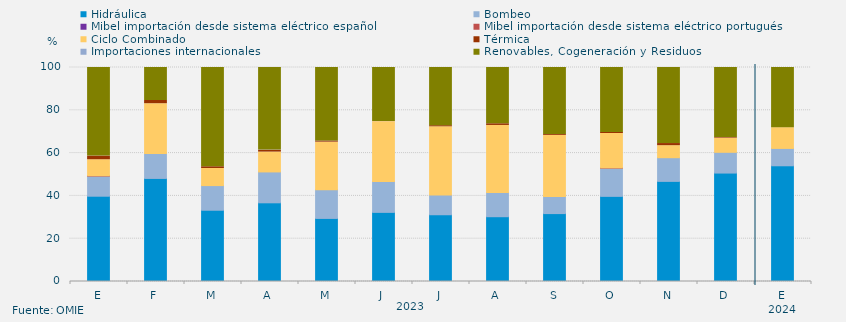
| Category | Hidráulica | Bombeo | Mibel importación desde sistema eléctrico español | Mibel importación desde sistema eléctrico portugués | Ciclo Combinado | Térmica | Importaciones internacionales | Renovables, Cogeneración y Residuos |
|---|---|---|---|---|---|---|---|---|
| E | 39.852 | 9.42 | 0 | 0.134 | 7.493 | 1.703 | 0 | 41.398 |
| F | 48.165 | 11.657 | 0 | 0 | 23.264 | 1.488 | 0 | 15.427 |
| M | 33.3 | 11.519 | 0 | 0 | 7.974 | 0.83 | 0 | 46.377 |
| A | 36.771 | 14.433 | 0 | 0 | 9.271 | 0.88 | 0.069 | 38.576 |
| M | 29.48 | 13.418 | 0 | 0 | 22.222 | 0.538 | 0 | 34.341 |
| J | 32.303 | 14.468 | 0 | 0 | 27.905 | 0.035 | 0 | 25.289 |
| J | 31.194 | 9.218 | 0 | 0 | 31.888 | 0.515 | 0 | 27.184 |
| A | 30.276 | 11.279 | 0 | 0 | 31.362 | 0.795 | 0 | 26.288 |
| S | 31.736 | 7.94 | 0 | 0 | 28.611 | 0.463 | 0 | 31.25 |
| O | 39.785 | 13.172 | 0 | 0.134 | 16.062 | 0.493 | 0 | 30.354 |
| N | 46.782 | 11.065 | 0 | 0 | 5.625 | 0.995 | 0 | 35.532 |
| D | 50.672 | 9.7 | 0 | 0 | 6.608 | 0.291 | 0 | 32.728 |
| E | 54.077 | 8.109 | 0 | 0 | 9.7 | 0 | 0 | 28.114 |